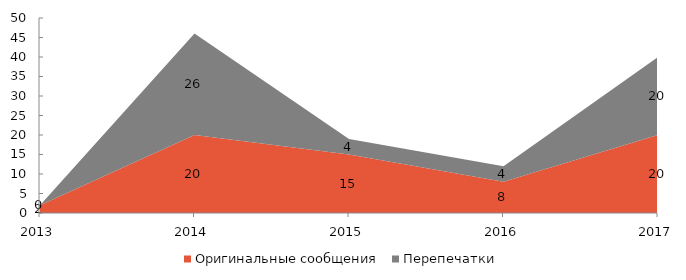
| Category | Оригинальные сообщения | Перепечатки |
|---|---|---|
| 2013 | 2 | 0 |
| 2014 | 20 | 26 |
| 2015 | 15 | 4 |
| 2016 | 8 | 4 |
| 2017 | 20 | 20 |